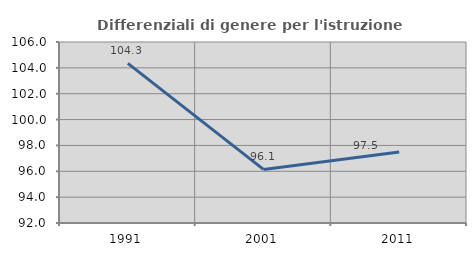
| Category | Differenziali di genere per l'istruzione superiore |
|---|---|
| 1991.0 | 104.348 |
| 2001.0 | 96.146 |
| 2011.0 | 97.489 |